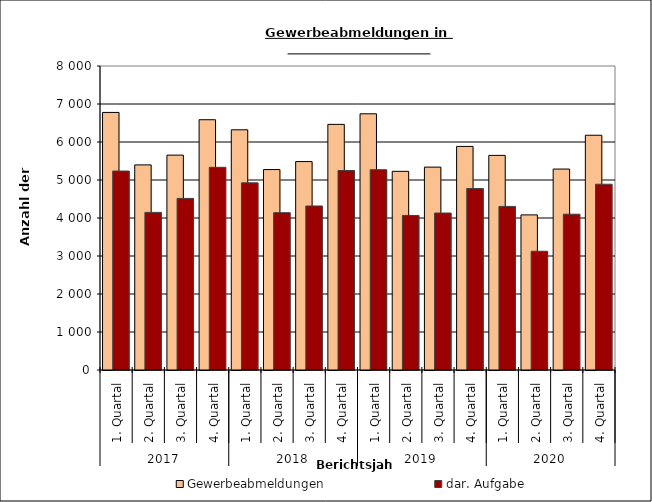
| Category | Gewerbeabmeldungen | dar. Aufgabe |
|---|---|---|
| 0 | 6778 | 5236 |
| 1 | 5398 | 4148 |
| 2 | 5655 | 4516 |
| 3 | 6586 | 5334 |
| 4 | 6321 | 4925 |
| 5 | 5275 | 4141 |
| 6 | 5485 | 4317 |
| 7 | 6464 | 5250 |
| 8 | 6742 | 5271 |
| 9 | 5228 | 4067 |
| 10 | 5339 | 4131 |
| 11 | 5884 | 4776 |
| 12 | 5648 | 4305 |
| 13 | 4082 | 3125 |
| 14 | 5288 | 4100 |
| 15 | 6178 | 4889 |